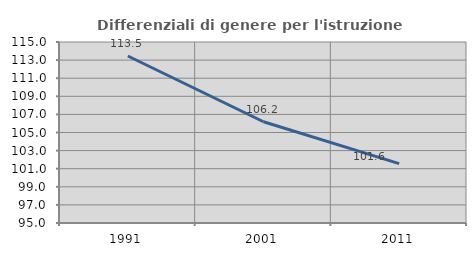
| Category | Differenziali di genere per l'istruzione superiore |
|---|---|
| 1991.0 | 113.453 |
| 2001.0 | 106.19 |
| 2011.0 | 101.562 |